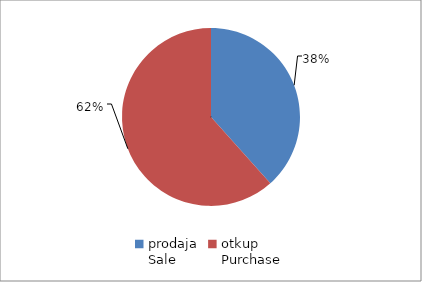
| Category | Series 0 |
|---|---|
| prodaja
Sale | 10264075 |
| otkup
Purchase | 16471227 |